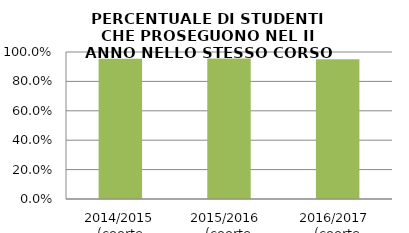
| Category | 2014/2015 (coorte 2013/14) 2015/2016  (coorte 2014/15) 2016/2017  (coorte 2015/16) |
|---|---|
| 2014/2015 (coorte 2013/14) | 0.954 |
| 2015/2016  (coorte 2014/15) | 0.955 |
| 2016/2017  (coorte 2015/16) | 0.951 |